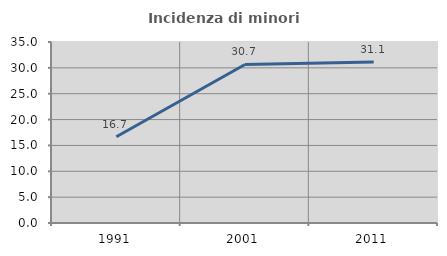
| Category | Incidenza di minori stranieri |
|---|---|
| 1991.0 | 16.667 |
| 2001.0 | 30.66 |
| 2011.0 | 31.13 |